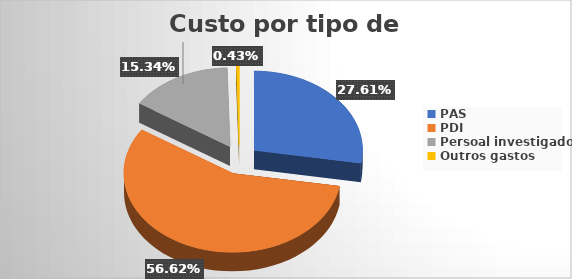
| Category | Custo por tipo de persoal |
|---|---|
| PAS | 0.276 |
| PDI | 0.566 |
| Persoal investigador | 0.153 |
| Outros gastos | 0.004 |